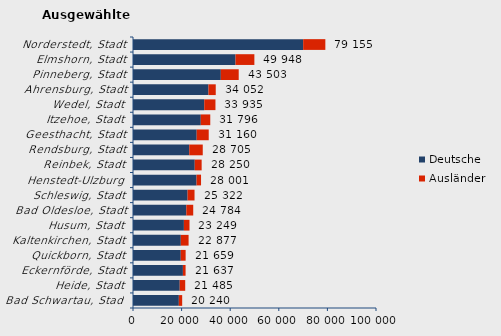
| Category | Deutsche | Ausländer | Series 2 |
|---|---|---|---|
| Bad Schwartau, Stadt | 18865 | 1375 | 20240 |
| Heide, Stadt | 19229 | 2256 | 21485 |
| Eckernförde, Stadt | 20539 | 1098 | 21637 |
| Quickborn, Stadt | 19655 | 2004 | 21659 |
| Kaltenkirchen, Stadt | 19671 | 3206 | 22877 |
| Husum, Stadt | 20948 | 2301 | 23249 |
| Bad Oldesloe, Stadt | 21937 | 2847 | 24784 |
| Schleswig, Stadt | 22468 | 2854 | 25322 |
| Henstedt-Ulzburg | 26149 | 1852 | 28001 |
| Reinbek, Stadt | 25410 | 2840 | 28250 |
| Rendsburg, Stadt | 23146 | 5559 | 28705 |
| Geesthacht, Stadt | 26215 | 4945 | 31160 |
| Itzehoe, Stadt | 27896 | 3900 | 31796 |
| Wedel, Stadt | 29324 | 4611 | 33935 |
| Ahrensburg, Stadt | 31051 | 3001 | 34052 |
| Pinneberg, Stadt | 36138 | 7365 | 43503 |
| Elmshorn, Stadt | 42187 | 7761 | 49948 |
| Norderstedt, Stadt | 70024 | 9131 | 79155 |